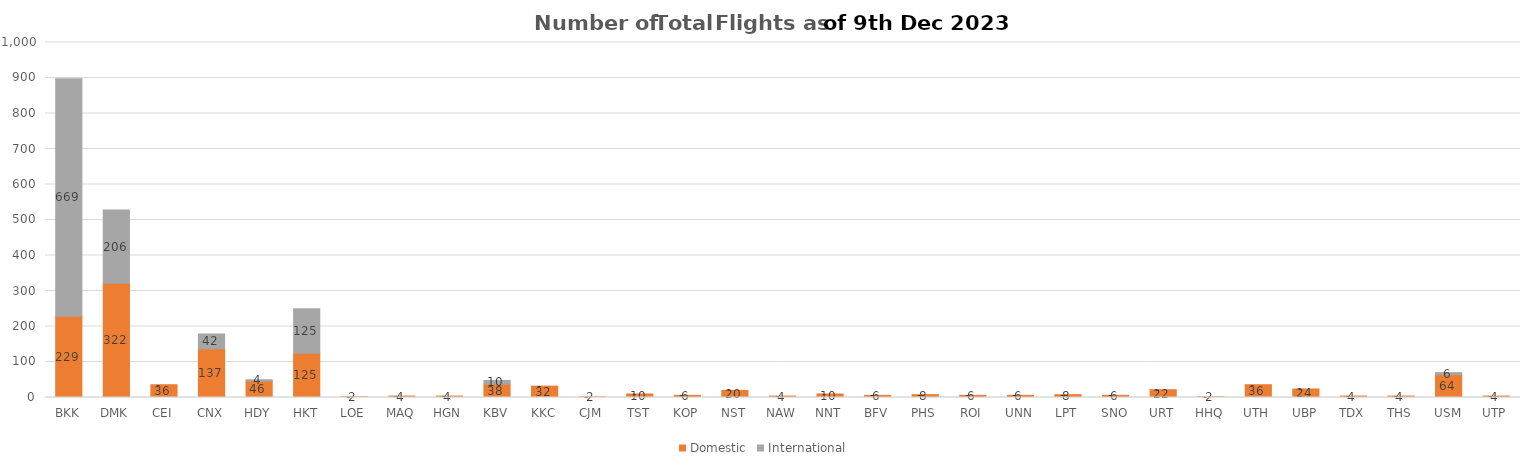
| Category | Domestic | International |
|---|---|---|
| BKK | 229 | 669 |
| DMK | 322 | 206 |
| CEI | 36 | 0 |
| CNX | 137 | 42 |
| HDY | 46 | 4 |
| HKT | 125 | 125 |
| LOE | 2 | 0 |
| MAQ | 4 | 0 |
| HGN | 4 | 0 |
| KBV | 38 | 10 |
| KKC | 32 | 0 |
| CJM | 2 | 0 |
| TST | 10 | 0 |
| KOP | 6 | 0 |
| NST | 20 | 0 |
| NAW | 4 | 0 |
| NNT | 10 | 0 |
| BFV | 6 | 0 |
| PHS | 8 | 0 |
| ROI | 6 | 0 |
| UNN | 6 | 0 |
| LPT | 8 | 0 |
| SNO | 6 | 0 |
| URT | 22 | 0 |
| HHQ | 2 | 0 |
| UTH | 36 | 0 |
| UBP | 24 | 0 |
| TDX | 4 | 0 |
| THS | 4 | 0 |
| USM | 64 | 6 |
| UTP | 4 | 0 |